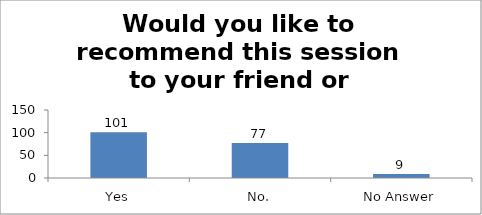
| Category | Would you like to recommend this session to your friend or colleague? |
|---|---|
| Yes | 101 |
| No. | 77 |
| No Answer | 9 |